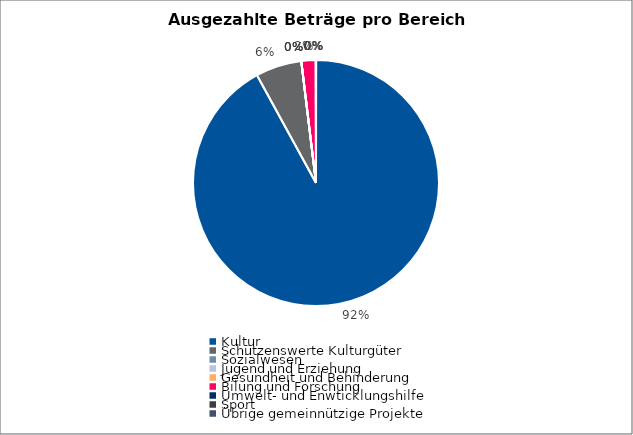
| Category | Series 0 |
|---|---|
| Kultur | 9115967 |
| Schützenswerte Kulturgüter | 600000 |
| Sozialwesen | 0 |
| Jugend und Erziehung | 0 |
| Gesundheit und Behinderung | 0 |
| Bilung und Forschung | 185000 |
| Umwelt- und Enwticklungshilfe | 5000 |
| Sport | 0 |
| Übrige gemeinnützige Projekte | 0 |